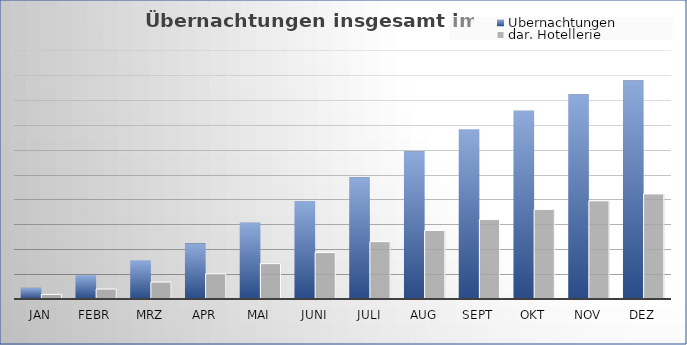
| Category | Übernachtungen | dar. Hotellerie |
|---|---|---|
| Jan | 22414 | 9277 |
| Febr | 47691 | 20022 |
| Mrz | 77769 | 33957 |
| Apr | 111334 | 50452 |
| Mai | 153230 | 70975 |
| Juni | 196611 | 93308 |
| Juli | 243896 | 115179 |
| Aug | 296003 | 137698 |
| Sept | 340729 | 159747 |
| Okt | 378096 | 179941 |
| Nov | 410550 | 197155 |
| Dez | 438654 | 211019 |